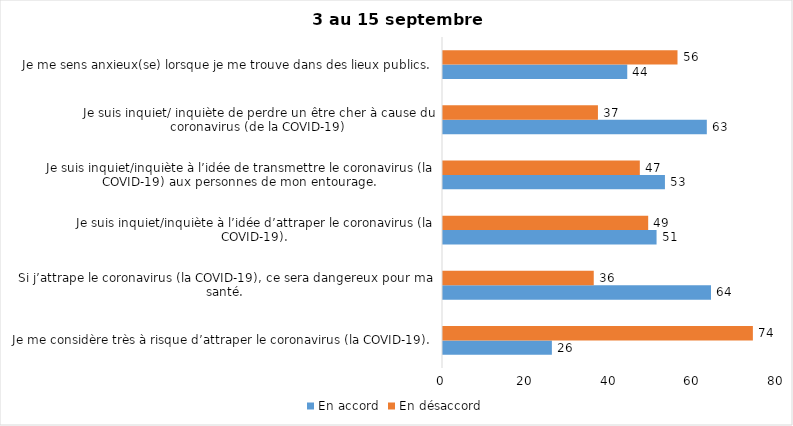
| Category | En accord | En désaccord |
|---|---|---|
| Je me considère très à risque d’attraper le coronavirus (la COVID-19). | 26 | 74 |
| Si j’attrape le coronavirus (la COVID-19), ce sera dangereux pour ma santé. | 64 | 36 |
| Je suis inquiet/inquiète à l’idée d’attraper le coronavirus (la COVID-19). | 51 | 49 |
| Je suis inquiet/inquiète à l’idée de transmettre le coronavirus (la COVID-19) aux personnes de mon entourage. | 53 | 47 |
| Je suis inquiet/ inquiète de perdre un être cher à cause du coronavirus (de la COVID-19) | 63 | 37 |
| Je me sens anxieux(se) lorsque je me trouve dans des lieux publics. | 44 | 56 |